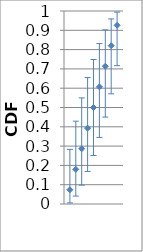
| Category | 0.5 |
|---|---|
| 7.0 | 0.714 |
| 4.0 | 0.393 |
| 8.0 | 0.82 |
| 6.0 | 0.607 |
| 9.0 | 0.926 |
| 5.0 | 0.5 |
| 1.0 | 0.074 |
| 2.0 | 0.18 |
| 3.0 | 0.286 |